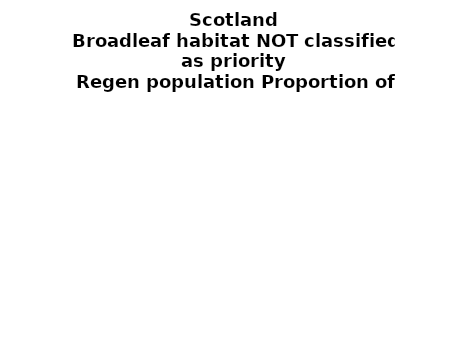
| Category | Broadleaf habitat NOT classified as priority |
|---|---|
| None | 0.085 |
| Seedlings only | 0 |
| Seedlings, saplings only | 0.009 |
| Seedlings, saplings, <7 cm trees | 0.181 |
| Saplings only | 0.223 |
| <7 cm trees, seedlings only | 0 |
| <7 cm trees, saplings only | 0.413 |
| <7 cm Trees only | 0.089 |